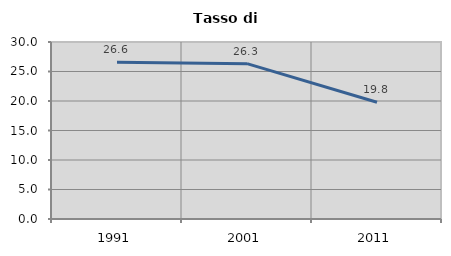
| Category | Tasso di disoccupazione   |
|---|---|
| 1991.0 | 26.562 |
| 2001.0 | 26.332 |
| 2011.0 | 19.781 |